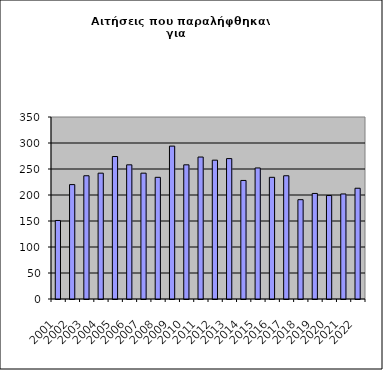
| Category | Series 1 |
|---|---|
| 2001.0 | 151 |
| 2002.0 | 220 |
| 2003.0 | 237 |
| 2004.0 | 242 |
| 2005.0 | 274 |
| 2006.0 | 258 |
| 2007.0 | 242 |
| 2008.0 | 234 |
| 2009.0 | 294 |
| 2010.0 | 258 |
| 2011.0 | 273 |
| 2012.0 | 267 |
| 2013.0 | 270 |
| 2014.0 | 228 |
| 2015.0 | 252 |
| 2016.0 | 234 |
| 2017.0 | 237 |
| 2018.0 | 191 |
| 2019.0 | 203 |
| 2020.0 | 199 |
| 2021.0 | 202 |
| 2022.0 | 213 |